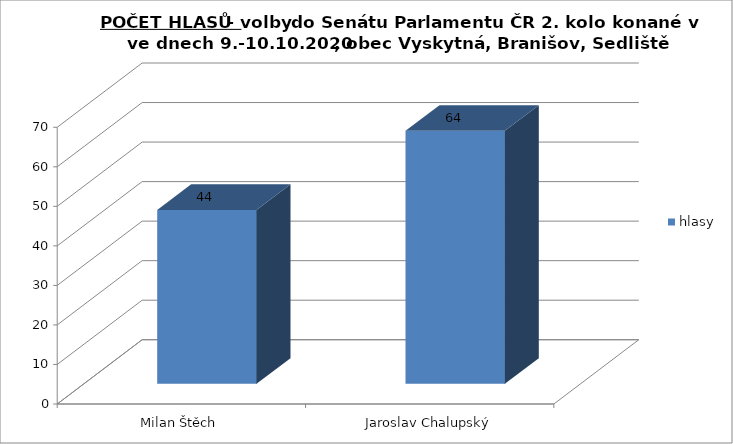
| Category | hlasy |
|---|---|
| Milan Štěch | 44 |
| Jaroslav Chalupský | 64 |